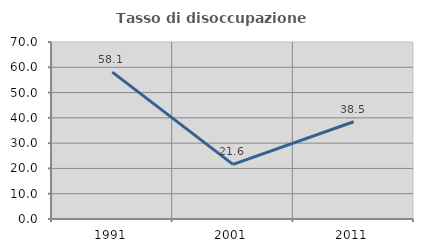
| Category | Tasso di disoccupazione giovanile  |
|---|---|
| 1991.0 | 58.065 |
| 2001.0 | 21.622 |
| 2011.0 | 38.462 |